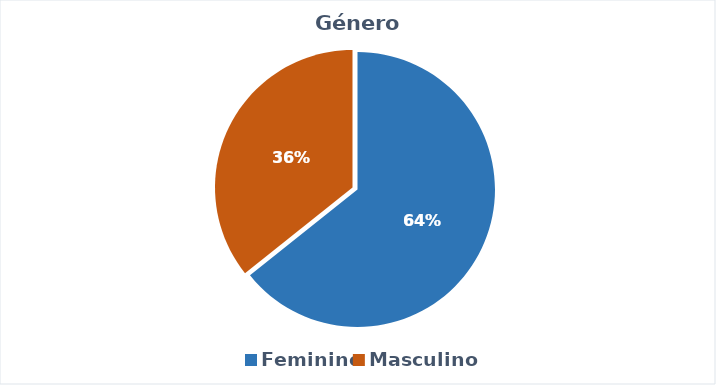
| Category | Series 0 |
|---|---|
| Feminino | 9 |
| Masculino | 5 |